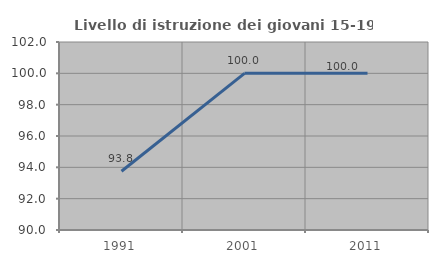
| Category | Livello di istruzione dei giovani 15-19 anni |
|---|---|
| 1991.0 | 93.75 |
| 2001.0 | 100 |
| 2011.0 | 100 |